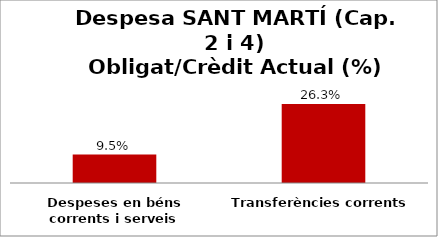
| Category | Series 0 |
|---|---|
| Despeses en béns corrents i serveis | 0.095 |
| Transferències corrents | 0.263 |